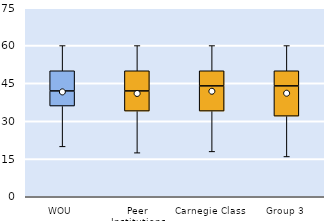
| Category | 25th | 50th | 75th |
|---|---|---|---|
| WOU | 36 | 6 | 8 |
| Peer Institutions | 34 | 8 | 8 |
| Carnegie Class | 34 | 10 | 6 |
| Group 3 | 32 | 12 | 6 |